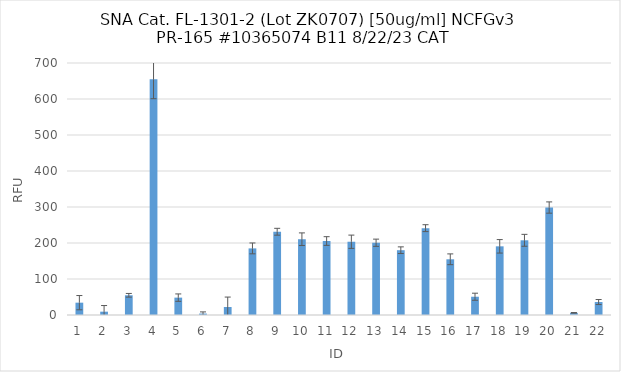
| Category | RFU |
|---|---|
| 0 | 34.25 |
| 1 | 9.25 |
| 2 | 54.75 |
| 3 | 654.75 |
| 4 | 48.25 |
| 5 | 4 |
| 6 | 22.25 |
| 7 | 185 |
| 8 | 231.25 |
| 9 | 210.5 |
| 10 | 205.5 |
| 11 | 203.5 |
| 12 | 200.75 |
| 13 | 180 |
| 14 | 241.25 |
| 15 | 154.75 |
| 16 | 50.75 |
| 17 | 190.75 |
| 18 | 207.5 |
| 19 | 298.5 |
| 20 | 6 |
| 21 | 36 |